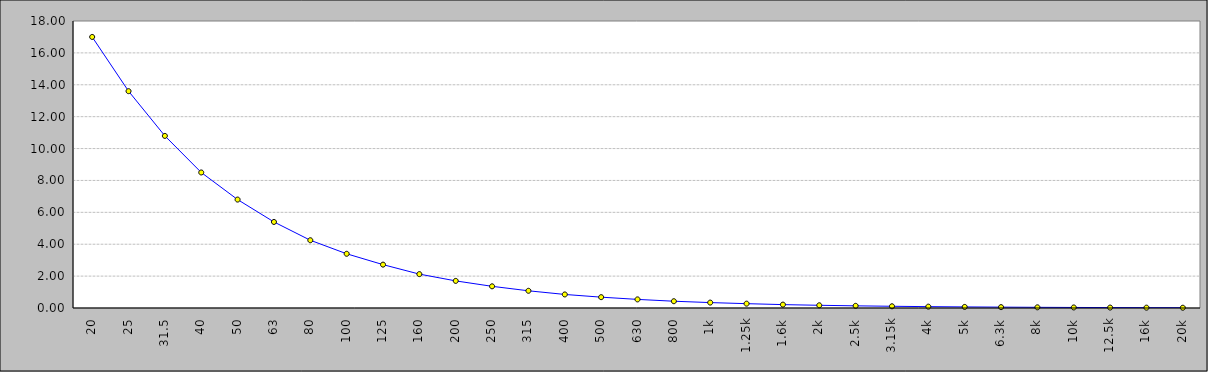
| Category | Series 0 |
|---|---|
| 20 | 17 |
| 25 | 13.6 |
| 31.5 | 10.794 |
| 40 | 8.5 |
| 50 | 6.8 |
| 63 | 5.397 |
| 80 | 4.25 |
| 100 | 3.4 |
| 125 | 2.72 |
| 160 | 2.125 |
| 200 | 1.7 |
| 250 | 1.36 |
| 315 | 1.079 |
| 400 | 0.85 |
| 500 | 0.68 |
| 630 | 0.54 |
| 800 | 0.425 |
| 1k | 0.34 |
| 1.25k | 0.272 |
| 1.6k | 0.212 |
| 2k | 0.17 |
| 2.5k | 0.136 |
| 3.15k | 0.108 |
| 4k | 0.085 |
| 5k | 0.068 |
| 6.3k | 0.054 |
| 8k | 0.042 |
| 10k | 0.034 |
| 12.5k | 0.027 |
| 16k | 0.021 |
| 20k | 0.017 |